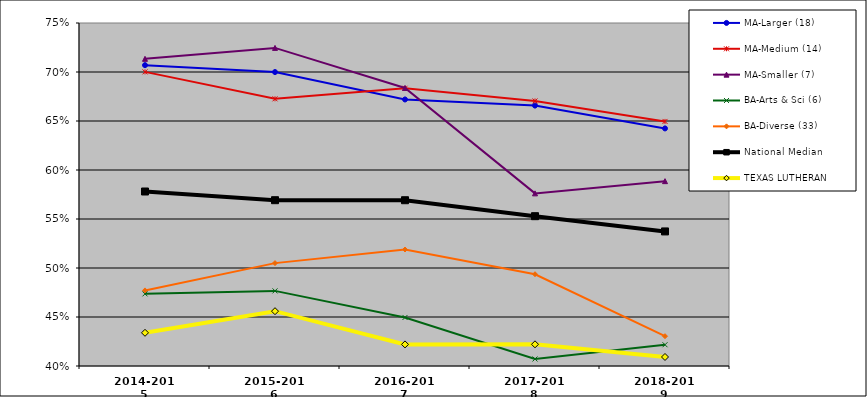
| Category | MA-Larger (18) | MA-Medium (14) | MA-Smaller (7) | BA-Arts & Sci (6) | BA-Diverse (33) | National Median |  TEXAS LUTHERAN  |
|---|---|---|---|---|---|---|---|
| 2014-2015 | 0.707 | 0.7 | 0.713 | 0.474 | 0.477 | 0.578 | 0.434 |
| 2015-2016 | 0.7 | 0.673 | 0.725 | 0.477 | 0.505 | 0.569 | 0.456 |
| 2016-2017 | 0.672 | 0.683 | 0.684 | 0.45 | 0.519 | 0.569 | 0.422 |
| 2017-2018 | 0.666 | 0.67 | 0.576 | 0.407 | 0.494 | 0.553 | 0.422 |
| 2018-2019 | 0.642 | 0.65 | 0.589 | 0.422 | 0.43 | 0.537 | 0.409 |